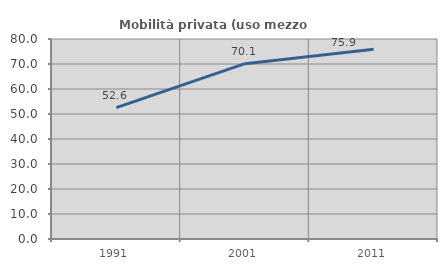
| Category | Mobilità privata (uso mezzo privato) |
|---|---|
| 1991.0 | 52.553 |
| 2001.0 | 70.132 |
| 2011.0 | 75.862 |